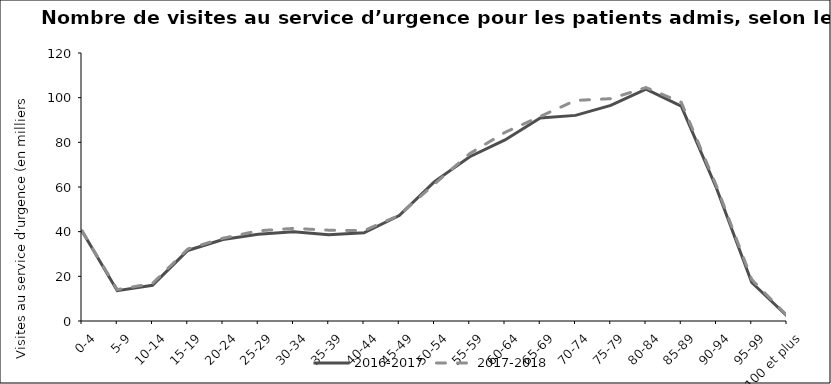
| Category | 2016-2017 | 2017-2018 |
|---|---|---|
| 0-4 | 40.298 | 40.395 |
| 5-9 | 13.555 | 14.075 |
| 10-14 | 15.969 | 16.796 |
| 15-19 | 31.591 | 32.228 |
| 20-24 | 36.461 | 37.067 |
| 25-29 | 38.82 | 40.387 |
| 30-34 | 39.938 | 41.471 |
| 35-39 | 38.616 | 40.666 |
| 40-44 | 39.517 | 40.446 |
| 45-49 | 47.244 | 47.334 |
| 50-54 | 62.441 | 61.363 |
| 55-59 | 73.536 | 74.954 |
| 60-64 | 81.063 | 84.467 |
| 65-69 | 90.944 | 91.581 |
| 70-74 | 92.068 | 98.764 |
| 75-79 | 96.52 | 99.545 |
| 80-84 | 103.861 | 104.525 |
| 85-89 | 96.171 | 97.924 |
| 90-94 | 59.426 | 60.44 |
| 95-99 | 17.234 | 18.548 |
| 100 et plus | 2.244 | 2.421 |